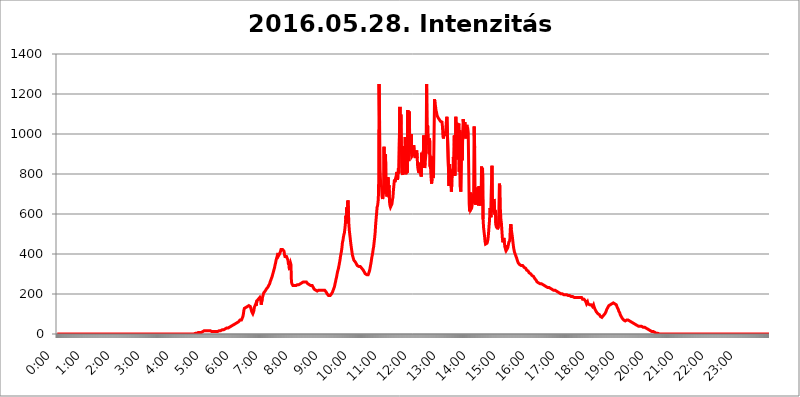
| Category | 2016.05.28. Intenzitás [W/m^2] |
|---|---|
| 0.0 | 0 |
| 0.0006944444444444445 | 0 |
| 0.001388888888888889 | 0 |
| 0.0020833333333333333 | 0 |
| 0.002777777777777778 | 0 |
| 0.003472222222222222 | 0 |
| 0.004166666666666667 | 0 |
| 0.004861111111111111 | 0 |
| 0.005555555555555556 | 0 |
| 0.0062499999999999995 | 0 |
| 0.006944444444444444 | 0 |
| 0.007638888888888889 | 0 |
| 0.008333333333333333 | 0 |
| 0.009027777777777779 | 0 |
| 0.009722222222222222 | 0 |
| 0.010416666666666666 | 0 |
| 0.011111111111111112 | 0 |
| 0.011805555555555555 | 0 |
| 0.012499999999999999 | 0 |
| 0.013194444444444444 | 0 |
| 0.013888888888888888 | 0 |
| 0.014583333333333332 | 0 |
| 0.015277777777777777 | 0 |
| 0.015972222222222224 | 0 |
| 0.016666666666666666 | 0 |
| 0.017361111111111112 | 0 |
| 0.018055555555555557 | 0 |
| 0.01875 | 0 |
| 0.019444444444444445 | 0 |
| 0.02013888888888889 | 0 |
| 0.020833333333333332 | 0 |
| 0.02152777777777778 | 0 |
| 0.022222222222222223 | 0 |
| 0.02291666666666667 | 0 |
| 0.02361111111111111 | 0 |
| 0.024305555555555556 | 0 |
| 0.024999999999999998 | 0 |
| 0.025694444444444447 | 0 |
| 0.02638888888888889 | 0 |
| 0.027083333333333334 | 0 |
| 0.027777777777777776 | 0 |
| 0.02847222222222222 | 0 |
| 0.029166666666666664 | 0 |
| 0.029861111111111113 | 0 |
| 0.030555555555555555 | 0 |
| 0.03125 | 0 |
| 0.03194444444444445 | 0 |
| 0.03263888888888889 | 0 |
| 0.03333333333333333 | 0 |
| 0.034027777777777775 | 0 |
| 0.034722222222222224 | 0 |
| 0.035416666666666666 | 0 |
| 0.036111111111111115 | 0 |
| 0.03680555555555556 | 0 |
| 0.0375 | 0 |
| 0.03819444444444444 | 0 |
| 0.03888888888888889 | 0 |
| 0.03958333333333333 | 0 |
| 0.04027777777777778 | 0 |
| 0.04097222222222222 | 0 |
| 0.041666666666666664 | 0 |
| 0.042361111111111106 | 0 |
| 0.04305555555555556 | 0 |
| 0.043750000000000004 | 0 |
| 0.044444444444444446 | 0 |
| 0.04513888888888889 | 0 |
| 0.04583333333333334 | 0 |
| 0.04652777777777778 | 0 |
| 0.04722222222222222 | 0 |
| 0.04791666666666666 | 0 |
| 0.04861111111111111 | 0 |
| 0.049305555555555554 | 0 |
| 0.049999999999999996 | 0 |
| 0.05069444444444445 | 0 |
| 0.051388888888888894 | 0 |
| 0.052083333333333336 | 0 |
| 0.05277777777777778 | 0 |
| 0.05347222222222222 | 0 |
| 0.05416666666666667 | 0 |
| 0.05486111111111111 | 0 |
| 0.05555555555555555 | 0 |
| 0.05625 | 0 |
| 0.05694444444444444 | 0 |
| 0.057638888888888885 | 0 |
| 0.05833333333333333 | 0 |
| 0.05902777777777778 | 0 |
| 0.059722222222222225 | 0 |
| 0.06041666666666667 | 0 |
| 0.061111111111111116 | 0 |
| 0.06180555555555556 | 0 |
| 0.0625 | 0 |
| 0.06319444444444444 | 0 |
| 0.06388888888888888 | 0 |
| 0.06458333333333334 | 0 |
| 0.06527777777777778 | 0 |
| 0.06597222222222222 | 0 |
| 0.06666666666666667 | 0 |
| 0.06736111111111111 | 0 |
| 0.06805555555555555 | 0 |
| 0.06874999999999999 | 0 |
| 0.06944444444444443 | 0 |
| 0.07013888888888889 | 0 |
| 0.07083333333333333 | 0 |
| 0.07152777777777779 | 0 |
| 0.07222222222222223 | 0 |
| 0.07291666666666667 | 0 |
| 0.07361111111111111 | 0 |
| 0.07430555555555556 | 0 |
| 0.075 | 0 |
| 0.07569444444444444 | 0 |
| 0.0763888888888889 | 0 |
| 0.07708333333333334 | 0 |
| 0.07777777777777778 | 0 |
| 0.07847222222222222 | 0 |
| 0.07916666666666666 | 0 |
| 0.0798611111111111 | 0 |
| 0.08055555555555556 | 0 |
| 0.08125 | 0 |
| 0.08194444444444444 | 0 |
| 0.08263888888888889 | 0 |
| 0.08333333333333333 | 0 |
| 0.08402777777777777 | 0 |
| 0.08472222222222221 | 0 |
| 0.08541666666666665 | 0 |
| 0.08611111111111112 | 0 |
| 0.08680555555555557 | 0 |
| 0.08750000000000001 | 0 |
| 0.08819444444444445 | 0 |
| 0.08888888888888889 | 0 |
| 0.08958333333333333 | 0 |
| 0.09027777777777778 | 0 |
| 0.09097222222222222 | 0 |
| 0.09166666666666667 | 0 |
| 0.09236111111111112 | 0 |
| 0.09305555555555556 | 0 |
| 0.09375 | 0 |
| 0.09444444444444444 | 0 |
| 0.09513888888888888 | 0 |
| 0.09583333333333333 | 0 |
| 0.09652777777777777 | 0 |
| 0.09722222222222222 | 0 |
| 0.09791666666666667 | 0 |
| 0.09861111111111111 | 0 |
| 0.09930555555555555 | 0 |
| 0.09999999999999999 | 0 |
| 0.10069444444444443 | 0 |
| 0.1013888888888889 | 0 |
| 0.10208333333333335 | 0 |
| 0.10277777777777779 | 0 |
| 0.10347222222222223 | 0 |
| 0.10416666666666667 | 0 |
| 0.10486111111111111 | 0 |
| 0.10555555555555556 | 0 |
| 0.10625 | 0 |
| 0.10694444444444444 | 0 |
| 0.1076388888888889 | 0 |
| 0.10833333333333334 | 0 |
| 0.10902777777777778 | 0 |
| 0.10972222222222222 | 0 |
| 0.1111111111111111 | 0 |
| 0.11180555555555556 | 0 |
| 0.11180555555555556 | 0 |
| 0.1125 | 0 |
| 0.11319444444444444 | 0 |
| 0.11388888888888889 | 0 |
| 0.11458333333333333 | 0 |
| 0.11527777777777777 | 0 |
| 0.11597222222222221 | 0 |
| 0.11666666666666665 | 0 |
| 0.1173611111111111 | 0 |
| 0.11805555555555557 | 0 |
| 0.11944444444444445 | 0 |
| 0.12013888888888889 | 0 |
| 0.12083333333333333 | 0 |
| 0.12152777777777778 | 0 |
| 0.12222222222222223 | 0 |
| 0.12291666666666667 | 0 |
| 0.12291666666666667 | 0 |
| 0.12361111111111112 | 0 |
| 0.12430555555555556 | 0 |
| 0.125 | 0 |
| 0.12569444444444444 | 0 |
| 0.12638888888888888 | 0 |
| 0.12708333333333333 | 0 |
| 0.16875 | 0 |
| 0.12847222222222224 | 0 |
| 0.12916666666666668 | 0 |
| 0.12986111111111112 | 0 |
| 0.13055555555555556 | 0 |
| 0.13125 | 0 |
| 0.13194444444444445 | 0 |
| 0.1326388888888889 | 0 |
| 0.13333333333333333 | 0 |
| 0.13402777777777777 | 0 |
| 0.13402777777777777 | 0 |
| 0.13472222222222222 | 0 |
| 0.13541666666666666 | 0 |
| 0.1361111111111111 | 0 |
| 0.13749999999999998 | 0 |
| 0.13819444444444443 | 0 |
| 0.1388888888888889 | 0 |
| 0.13958333333333334 | 0 |
| 0.14027777777777778 | 0 |
| 0.14097222222222222 | 0 |
| 0.14166666666666666 | 0 |
| 0.1423611111111111 | 0 |
| 0.14305555555555557 | 0 |
| 0.14375000000000002 | 0 |
| 0.14444444444444446 | 0 |
| 0.1451388888888889 | 0 |
| 0.1451388888888889 | 0 |
| 0.14652777777777778 | 0 |
| 0.14722222222222223 | 0 |
| 0.14791666666666667 | 0 |
| 0.1486111111111111 | 0 |
| 0.14930555555555555 | 0 |
| 0.15 | 0 |
| 0.15069444444444444 | 0 |
| 0.15138888888888888 | 0 |
| 0.15208333333333332 | 0 |
| 0.15277777777777776 | 0 |
| 0.15347222222222223 | 0 |
| 0.15416666666666667 | 0 |
| 0.15486111111111112 | 0 |
| 0.15555555555555556 | 0 |
| 0.15625 | 0 |
| 0.15694444444444444 | 0 |
| 0.15763888888888888 | 0 |
| 0.15833333333333333 | 0 |
| 0.15902777777777777 | 0 |
| 0.15972222222222224 | 0 |
| 0.16041666666666668 | 0 |
| 0.16111111111111112 | 0 |
| 0.16180555555555556 | 0 |
| 0.1625 | 0 |
| 0.16319444444444445 | 0 |
| 0.1638888888888889 | 0 |
| 0.16458333333333333 | 0 |
| 0.16527777777777777 | 0 |
| 0.16597222222222222 | 0 |
| 0.16666666666666666 | 0 |
| 0.1673611111111111 | 0 |
| 0.16805555555555554 | 0 |
| 0.16874999999999998 | 0 |
| 0.16944444444444443 | 0 |
| 0.17013888888888887 | 0 |
| 0.1708333333333333 | 0 |
| 0.17152777777777775 | 0 |
| 0.17222222222222225 | 0 |
| 0.1729166666666667 | 0 |
| 0.17361111111111113 | 0 |
| 0.17430555555555557 | 0 |
| 0.17500000000000002 | 0 |
| 0.17569444444444446 | 0 |
| 0.1763888888888889 | 0 |
| 0.17708333333333334 | 0 |
| 0.17777777777777778 | 0 |
| 0.17847222222222223 | 0 |
| 0.17916666666666667 | 0 |
| 0.1798611111111111 | 0 |
| 0.18055555555555555 | 0 |
| 0.18125 | 0 |
| 0.18194444444444444 | 0 |
| 0.1826388888888889 | 0 |
| 0.18333333333333335 | 0 |
| 0.1840277777777778 | 0 |
| 0.18472222222222223 | 0 |
| 0.18541666666666667 | 0 |
| 0.18611111111111112 | 0 |
| 0.18680555555555556 | 0 |
| 0.1875 | 0 |
| 0.18819444444444444 | 0 |
| 0.18888888888888888 | 0 |
| 0.18958333333333333 | 0 |
| 0.19027777777777777 | 0 |
| 0.1909722222222222 | 0 |
| 0.19166666666666665 | 0 |
| 0.19236111111111112 | 0 |
| 0.19305555555555554 | 3.525 |
| 0.19375 | 3.525 |
| 0.19444444444444445 | 3.525 |
| 0.1951388888888889 | 3.525 |
| 0.19583333333333333 | 3.525 |
| 0.19652777777777777 | 7.887 |
| 0.19722222222222222 | 7.887 |
| 0.19791666666666666 | 7.887 |
| 0.1986111111111111 | 7.887 |
| 0.19930555555555554 | 7.887 |
| 0.19999999999999998 | 7.887 |
| 0.20069444444444443 | 7.887 |
| 0.20138888888888887 | 7.887 |
| 0.2020833333333333 | 7.887 |
| 0.2027777777777778 | 12.257 |
| 0.2034722222222222 | 12.257 |
| 0.2041666666666667 | 12.257 |
| 0.20486111111111113 | 12.257 |
| 0.20555555555555557 | 12.257 |
| 0.20625000000000002 | 16.636 |
| 0.20694444444444446 | 16.636 |
| 0.2076388888888889 | 16.636 |
| 0.20833333333333334 | 16.636 |
| 0.20902777777777778 | 16.636 |
| 0.20972222222222223 | 16.636 |
| 0.21041666666666667 | 16.636 |
| 0.2111111111111111 | 16.636 |
| 0.21180555555555555 | 16.636 |
| 0.2125 | 16.636 |
| 0.21319444444444444 | 16.636 |
| 0.2138888888888889 | 16.636 |
| 0.21458333333333335 | 16.636 |
| 0.2152777777777778 | 16.636 |
| 0.21597222222222223 | 12.257 |
| 0.21666666666666667 | 12.257 |
| 0.21736111111111112 | 12.257 |
| 0.21805555555555556 | 12.257 |
| 0.21875 | 12.257 |
| 0.21944444444444444 | 12.257 |
| 0.22013888888888888 | 12.257 |
| 0.22083333333333333 | 12.257 |
| 0.22152777777777777 | 12.257 |
| 0.2222222222222222 | 12.257 |
| 0.22291666666666665 | 12.257 |
| 0.2236111111111111 | 12.257 |
| 0.22430555555555556 | 12.257 |
| 0.225 | 12.257 |
| 0.22569444444444445 | 12.257 |
| 0.2263888888888889 | 12.257 |
| 0.22708333333333333 | 16.636 |
| 0.22777777777777777 | 16.636 |
| 0.22847222222222222 | 16.636 |
| 0.22916666666666666 | 16.636 |
| 0.2298611111111111 | 16.636 |
| 0.23055555555555554 | 21.024 |
| 0.23124999999999998 | 21.024 |
| 0.23194444444444443 | 21.024 |
| 0.23263888888888887 | 21.024 |
| 0.2333333333333333 | 21.024 |
| 0.2340277777777778 | 25.419 |
| 0.2347222222222222 | 25.419 |
| 0.2354166666666667 | 25.419 |
| 0.23611111111111113 | 25.419 |
| 0.23680555555555557 | 29.823 |
| 0.23750000000000002 | 29.823 |
| 0.23819444444444446 | 29.823 |
| 0.2388888888888889 | 29.823 |
| 0.23958333333333334 | 29.823 |
| 0.24027777777777778 | 34.234 |
| 0.24097222222222223 | 34.234 |
| 0.24166666666666667 | 34.234 |
| 0.2423611111111111 | 38.653 |
| 0.24305555555555555 | 38.653 |
| 0.24375 | 38.653 |
| 0.24444444444444446 | 38.653 |
| 0.24513888888888888 | 38.653 |
| 0.24583333333333335 | 43.079 |
| 0.2465277777777778 | 43.079 |
| 0.24722222222222223 | 43.079 |
| 0.24791666666666667 | 47.511 |
| 0.24861111111111112 | 47.511 |
| 0.24930555555555556 | 47.511 |
| 0.25 | 51.951 |
| 0.25069444444444444 | 51.951 |
| 0.2513888888888889 | 56.398 |
| 0.2520833333333333 | 56.398 |
| 0.25277777777777777 | 56.398 |
| 0.2534722222222222 | 60.85 |
| 0.25416666666666665 | 60.85 |
| 0.2548611111111111 | 60.85 |
| 0.2555555555555556 | 65.31 |
| 0.25625000000000003 | 69.775 |
| 0.2569444444444445 | 69.775 |
| 0.2576388888888889 | 65.31 |
| 0.25833333333333336 | 69.775 |
| 0.2590277777777778 | 69.775 |
| 0.25972222222222224 | 74.246 |
| 0.2604166666666667 | 87.692 |
| 0.2611111111111111 | 101.184 |
| 0.26180555555555557 | 119.235 |
| 0.2625 | 128.284 |
| 0.26319444444444445 | 128.284 |
| 0.2638888888888889 | 132.814 |
| 0.26458333333333334 | 132.814 |
| 0.2652777777777778 | 137.347 |
| 0.2659722222222222 | 137.347 |
| 0.26666666666666666 | 137.347 |
| 0.2673611111111111 | 137.347 |
| 0.26805555555555555 | 141.884 |
| 0.26875 | 141.884 |
| 0.26944444444444443 | 137.347 |
| 0.2701388888888889 | 137.347 |
| 0.2708333333333333 | 137.347 |
| 0.27152777777777776 | 137.347 |
| 0.2722222222222222 | 119.235 |
| 0.27291666666666664 | 110.201 |
| 0.2736111111111111 | 105.69 |
| 0.2743055555555555 | 101.184 |
| 0.27499999999999997 | 105.69 |
| 0.27569444444444446 | 114.716 |
| 0.27638888888888885 | 132.814 |
| 0.27708333333333335 | 137.347 |
| 0.2777777777777778 | 137.347 |
| 0.27847222222222223 | 150.964 |
| 0.2791666666666667 | 141.884 |
| 0.2798611111111111 | 164.605 |
| 0.28055555555555556 | 169.156 |
| 0.28125 | 169.156 |
| 0.28194444444444444 | 173.709 |
| 0.2826388888888889 | 173.709 |
| 0.2833333333333333 | 178.264 |
| 0.28402777777777777 | 182.82 |
| 0.2847222222222222 | 178.264 |
| 0.28541666666666665 | 169.156 |
| 0.28611111111111115 | 146.423 |
| 0.28680555555555554 | 141.884 |
| 0.28750000000000003 | 178.264 |
| 0.2881944444444445 | 178.264 |
| 0.2888888888888889 | 196.497 |
| 0.28958333333333336 | 205.62 |
| 0.2902777777777778 | 205.62 |
| 0.29097222222222224 | 210.182 |
| 0.2916666666666667 | 214.746 |
| 0.2923611111111111 | 219.309 |
| 0.29305555555555557 | 223.873 |
| 0.29375 | 223.873 |
| 0.29444444444444445 | 228.436 |
| 0.2951388888888889 | 233 |
| 0.29583333333333334 | 237.564 |
| 0.2965277777777778 | 242.127 |
| 0.2972222222222222 | 246.689 |
| 0.29791666666666666 | 251.251 |
| 0.2986111111111111 | 260.373 |
| 0.29930555555555555 | 264.932 |
| 0.3 | 274.047 |
| 0.30069444444444443 | 278.603 |
| 0.3013888888888889 | 287.709 |
| 0.3020833333333333 | 296.808 |
| 0.30277777777777776 | 305.898 |
| 0.3034722222222222 | 314.98 |
| 0.30416666666666664 | 324.052 |
| 0.3048611111111111 | 333.113 |
| 0.3055555555555555 | 346.682 |
| 0.30624999999999997 | 355.712 |
| 0.3069444444444444 | 369.23 |
| 0.3076388888888889 | 378.224 |
| 0.30833333333333335 | 387.202 |
| 0.3090277777777778 | 396.164 |
| 0.30972222222222223 | 405.108 |
| 0.3104166666666667 | 391.685 |
| 0.3111111111111111 | 396.164 |
| 0.31180555555555556 | 400.638 |
| 0.3125 | 405.108 |
| 0.31319444444444444 | 414.035 |
| 0.3138888888888889 | 422.943 |
| 0.3145833333333333 | 427.39 |
| 0.31527777777777777 | 427.39 |
| 0.3159722222222222 | 422.943 |
| 0.31666666666666665 | 418.492 |
| 0.31736111111111115 | 418.492 |
| 0.31805555555555554 | 414.035 |
| 0.31875000000000003 | 396.164 |
| 0.3194444444444445 | 387.202 |
| 0.3201388888888889 | 382.715 |
| 0.32083333333333336 | 382.715 |
| 0.3215277777777778 | 387.202 |
| 0.32222222222222224 | 387.202 |
| 0.3229166666666667 | 382.715 |
| 0.3236111111111111 | 369.23 |
| 0.32430555555555557 | 346.682 |
| 0.325 | 364.728 |
| 0.32569444444444445 | 319.517 |
| 0.3263888888888889 | 346.682 |
| 0.32708333333333334 | 355.712 |
| 0.3277777777777778 | 346.682 |
| 0.3284722222222222 | 260.373 |
| 0.32916666666666666 | 251.251 |
| 0.3298611111111111 | 246.689 |
| 0.33055555555555555 | 242.127 |
| 0.33125 | 242.127 |
| 0.33194444444444443 | 242.127 |
| 0.3326388888888889 | 242.127 |
| 0.3333333333333333 | 242.127 |
| 0.3340277777777778 | 242.127 |
| 0.3347222222222222 | 242.127 |
| 0.3354166666666667 | 242.127 |
| 0.3361111111111111 | 246.689 |
| 0.3368055555555556 | 246.689 |
| 0.33749999999999997 | 246.689 |
| 0.33819444444444446 | 246.689 |
| 0.33888888888888885 | 246.689 |
| 0.33958333333333335 | 246.689 |
| 0.34027777777777773 | 246.689 |
| 0.34097222222222223 | 251.251 |
| 0.3416666666666666 | 251.251 |
| 0.3423611111111111 | 251.251 |
| 0.3430555555555555 | 255.813 |
| 0.34375 | 255.813 |
| 0.3444444444444445 | 260.373 |
| 0.3451388888888889 | 260.373 |
| 0.3458333333333334 | 260.373 |
| 0.34652777777777777 | 260.373 |
| 0.34722222222222227 | 260.373 |
| 0.34791666666666665 | 260.373 |
| 0.34861111111111115 | 260.373 |
| 0.34930555555555554 | 260.373 |
| 0.35000000000000003 | 255.813 |
| 0.3506944444444444 | 255.813 |
| 0.3513888888888889 | 251.251 |
| 0.3520833333333333 | 251.251 |
| 0.3527777777777778 | 251.251 |
| 0.3534722222222222 | 246.689 |
| 0.3541666666666667 | 246.689 |
| 0.3548611111111111 | 242.127 |
| 0.35555555555555557 | 242.127 |
| 0.35625 | 237.564 |
| 0.35694444444444445 | 242.127 |
| 0.3576388888888889 | 242.127 |
| 0.35833333333333334 | 242.127 |
| 0.3590277777777778 | 233 |
| 0.3597222222222222 | 228.436 |
| 0.36041666666666666 | 223.873 |
| 0.3611111111111111 | 223.873 |
| 0.36180555555555555 | 219.309 |
| 0.3625 | 219.309 |
| 0.36319444444444443 | 214.746 |
| 0.3638888888888889 | 219.309 |
| 0.3645833333333333 | 214.746 |
| 0.3652777777777778 | 214.746 |
| 0.3659722222222222 | 219.309 |
| 0.3666666666666667 | 219.309 |
| 0.3673611111111111 | 219.309 |
| 0.3680555555555556 | 219.309 |
| 0.36874999999999997 | 219.309 |
| 0.36944444444444446 | 223.873 |
| 0.37013888888888885 | 223.873 |
| 0.37083333333333335 | 219.309 |
| 0.37152777777777773 | 219.309 |
| 0.37222222222222223 | 219.309 |
| 0.3729166666666666 | 219.309 |
| 0.3736111111111111 | 219.309 |
| 0.3743055555555555 | 219.309 |
| 0.375 | 219.309 |
| 0.3756944444444445 | 219.309 |
| 0.3763888888888889 | 214.746 |
| 0.3770833333333334 | 210.182 |
| 0.37777777777777777 | 205.62 |
| 0.37847222222222227 | 201.058 |
| 0.37916666666666665 | 196.497 |
| 0.37986111111111115 | 196.497 |
| 0.38055555555555554 | 191.937 |
| 0.38125000000000003 | 191.937 |
| 0.3819444444444444 | 191.937 |
| 0.3826388888888889 | 191.937 |
| 0.3833333333333333 | 191.937 |
| 0.3840277777777778 | 191.937 |
| 0.3847222222222222 | 201.058 |
| 0.3854166666666667 | 201.058 |
| 0.3861111111111111 | 210.182 |
| 0.38680555555555557 | 214.746 |
| 0.3875 | 223.873 |
| 0.38819444444444445 | 228.436 |
| 0.3888888888888889 | 237.564 |
| 0.38958333333333334 | 251.251 |
| 0.3902777777777778 | 260.373 |
| 0.3909722222222222 | 274.047 |
| 0.39166666666666666 | 283.156 |
| 0.3923611111111111 | 296.808 |
| 0.39305555555555555 | 310.44 |
| 0.39375 | 319.517 |
| 0.39444444444444443 | 328.584 |
| 0.3951388888888889 | 342.162 |
| 0.3958333333333333 | 355.712 |
| 0.3965277777777778 | 369.23 |
| 0.3972222222222222 | 387.202 |
| 0.3979166666666667 | 400.638 |
| 0.3986111111111111 | 414.035 |
| 0.3993055555555556 | 431.833 |
| 0.39999999999999997 | 458.38 |
| 0.40069444444444446 | 467.187 |
| 0.40138888888888885 | 484.735 |
| 0.40208333333333335 | 497.836 |
| 0.40277777777777773 | 506.542 |
| 0.40347222222222223 | 528.2 |
| 0.4041666666666666 | 553.986 |
| 0.4048611111111111 | 592.233 |
| 0.4055555555555555 | 553.986 |
| 0.40625 | 634.105 |
| 0.4069444444444445 | 571.049 |
| 0.4076388888888889 | 667.123 |
| 0.4083333333333334 | 613.252 |
| 0.40902777777777777 | 549.704 |
| 0.40972222222222227 | 515.223 |
| 0.41041666666666665 | 493.475 |
| 0.41111111111111115 | 471.582 |
| 0.41180555555555554 | 449.551 |
| 0.41250000000000003 | 431.833 |
| 0.4131944444444444 | 414.035 |
| 0.4138888888888889 | 396.164 |
| 0.4145833333333333 | 387.202 |
| 0.4152777777777778 | 378.224 |
| 0.4159722222222222 | 369.23 |
| 0.4166666666666667 | 369.23 |
| 0.4173611111111111 | 364.728 |
| 0.41805555555555557 | 360.221 |
| 0.41875 | 355.712 |
| 0.41944444444444445 | 351.198 |
| 0.4201388888888889 | 346.682 |
| 0.42083333333333334 | 342.162 |
| 0.4215277777777778 | 342.162 |
| 0.4222222222222222 | 337.639 |
| 0.42291666666666666 | 337.639 |
| 0.4236111111111111 | 337.639 |
| 0.42430555555555555 | 337.639 |
| 0.425 | 337.639 |
| 0.42569444444444443 | 333.113 |
| 0.4263888888888889 | 333.113 |
| 0.4270833333333333 | 328.584 |
| 0.4277777777777778 | 324.052 |
| 0.4284722222222222 | 324.052 |
| 0.4291666666666667 | 319.517 |
| 0.4298611111111111 | 314.98 |
| 0.4305555555555556 | 310.44 |
| 0.43124999999999997 | 305.898 |
| 0.43194444444444446 | 301.354 |
| 0.43263888888888885 | 296.808 |
| 0.43333333333333335 | 296.808 |
| 0.43402777777777773 | 296.808 |
| 0.43472222222222223 | 296.808 |
| 0.4354166666666666 | 296.808 |
| 0.4361111111111111 | 296.808 |
| 0.4368055555555555 | 301.354 |
| 0.4375 | 310.44 |
| 0.4381944444444445 | 319.517 |
| 0.4388888888888889 | 333.113 |
| 0.4395833333333334 | 346.682 |
| 0.44027777777777777 | 360.221 |
| 0.44097222222222227 | 378.224 |
| 0.44166666666666665 | 391.685 |
| 0.44236111111111115 | 405.108 |
| 0.44305555555555554 | 422.943 |
| 0.44375000000000003 | 436.27 |
| 0.4444444444444444 | 458.38 |
| 0.4451388888888889 | 480.356 |
| 0.4458333333333333 | 506.542 |
| 0.4465277777777778 | 545.416 |
| 0.4472222222222222 | 575.299 |
| 0.4479166666666667 | 604.864 |
| 0.4486111111111111 | 634.105 |
| 0.44930555555555557 | 642.4 |
| 0.45 | 663.019 |
| 0.45069444444444445 | 707.8 |
| 0.4513888888888889 | 1250.275 |
| 0.45208333333333334 | 1052.255 |
| 0.4527777777777778 | 822.26 |
| 0.4534722222222222 | 759.723 |
| 0.45416666666666666 | 743.859 |
| 0.4548611111111111 | 735.89 |
| 0.45555555555555555 | 687.544 |
| 0.45625 | 675.311 |
| 0.45694444444444443 | 683.473 |
| 0.4576388888888889 | 707.8 |
| 0.4583333333333333 | 936.33 |
| 0.4590277777777778 | 703.762 |
| 0.4597222222222222 | 715.858 |
| 0.4604166666666667 | 898.668 |
| 0.4611111111111111 | 723.889 |
| 0.4618055555555556 | 703.762 |
| 0.46249999999999997 | 687.544 |
| 0.46319444444444446 | 687.544 |
| 0.46388888888888885 | 783.342 |
| 0.46458333333333335 | 727.896 |
| 0.46527777777777773 | 743.859 |
| 0.46597222222222223 | 663.019 |
| 0.4666666666666666 | 642.4 |
| 0.4673611111111111 | 634.105 |
| 0.4680555555555555 | 634.105 |
| 0.46875 | 638.256 |
| 0.4694444444444445 | 650.667 |
| 0.4701388888888889 | 671.22 |
| 0.4708333333333334 | 683.473 |
| 0.47152777777777777 | 719.877 |
| 0.47222222222222227 | 719.877 |
| 0.47291666666666665 | 771.559 |
| 0.47361111111111115 | 759.723 |
| 0.47430555555555554 | 775.492 |
| 0.47500000000000003 | 775.492 |
| 0.4756944444444444 | 795.074 |
| 0.4763888888888889 | 810.641 |
| 0.4770833333333333 | 771.559 |
| 0.4777777777777778 | 783.342 |
| 0.4784722222222222 | 829.981 |
| 0.4791666666666667 | 802.868 |
| 0.4798611111111111 | 802.868 |
| 0.48055555555555557 | 1135.543 |
| 0.48125 | 996.182 |
| 0.48194444444444445 | 1097.437 |
| 0.4826388888888889 | 940.082 |
| 0.48333333333333334 | 833.834 |
| 0.4840277777777778 | 806.757 |
| 0.4847222222222222 | 795.074 |
| 0.48541666666666666 | 940.082 |
| 0.4861111111111111 | 849.199 |
| 0.48680555555555555 | 856.855 |
| 0.4875 | 841.526 |
| 0.48819444444444443 | 984.98 |
| 0.4888888888888889 | 798.974 |
| 0.4895833333333333 | 795.074 |
| 0.4902777777777778 | 849.199 |
| 0.4909722222222222 | 806.757 |
| 0.4916666666666667 | 1120.238 |
| 0.4923611111111111 | 864.493 |
| 0.4930555555555556 | 1014.852 |
| 0.49374999999999997 | 1112.618 |
| 0.49444444444444446 | 947.58 |
| 0.49513888888888885 | 917.534 |
| 0.49583333333333335 | 902.447 |
| 0.49652777777777773 | 999.916 |
| 0.49722222222222223 | 887.309 |
| 0.4979166666666666 | 887.309 |
| 0.4986111111111111 | 891.099 |
| 0.4993055555555555 | 898.668 |
| 0.5 | 943.832 |
| 0.5006944444444444 | 902.447 |
| 0.5013888888888889 | 902.447 |
| 0.5020833333333333 | 879.719 |
| 0.5027777777777778 | 875.918 |
| 0.5034722222222222 | 883.516 |
| 0.5041666666666667 | 917.534 |
| 0.5048611111111111 | 879.719 |
| 0.5055555555555555 | 833.834 |
| 0.50625 | 829.981 |
| 0.5069444444444444 | 806.757 |
| 0.5076388888888889 | 849.199 |
| 0.5083333333333333 | 818.392 |
| 0.5090277777777777 | 802.868 |
| 0.5097222222222222 | 856.855 |
| 0.5104166666666666 | 787.258 |
| 0.5111111111111112 | 906.223 |
| 0.5118055555555555 | 829.981 |
| 0.5125000000000001 | 860.676 |
| 0.5131944444444444 | 853.029 |
| 0.513888888888889 | 992.448 |
| 0.5145833333333333 | 928.819 |
| 0.5152777777777778 | 829.981 |
| 0.5159722222222222 | 856.855 |
| 0.5166666666666667 | 860.676 |
| 0.517361111111111 | 909.996 |
| 0.5180555555555556 | 1250.275 |
| 0.5187499999999999 | 962.555 |
| 0.5194444444444445 | 1044.762 |
| 0.5201388888888888 | 962.555 |
| 0.5208333333333334 | 947.58 |
| 0.5215277777777778 | 902.447 |
| 0.5222222222222223 | 977.508 |
| 0.5229166666666667 | 837.682 |
| 0.5236111111111111 | 829.981 |
| 0.5243055555555556 | 783.342 |
| 0.525 | 751.803 |
| 0.5256944444444445 | 775.492 |
| 0.5263888888888889 | 887.309 |
| 0.5270833333333333 | 779.42 |
| 0.5277777777777778 | 798.974 |
| 0.5284722222222222 | 988.714 |
| 0.5291666666666667 | 1174.263 |
| 0.5298611111111111 | 1150.946 |
| 0.5305555555555556 | 1139.384 |
| 0.53125 | 1116.426 |
| 0.5319444444444444 | 1108.816 |
| 0.5326388888888889 | 1093.653 |
| 0.5333333333333333 | 1093.653 |
| 0.5340277777777778 | 1082.324 |
| 0.5347222222222222 | 1078.555 |
| 0.5354166666666667 | 1074.789 |
| 0.5361111111111111 | 1071.027 |
| 0.5368055555555555 | 1071.027 |
| 0.5375 | 1063.51 |
| 0.5381944444444444 | 1067.267 |
| 0.5388888888888889 | 1059.756 |
| 0.5395833333333333 | 1059.756 |
| 0.5402777777777777 | 1037.277 |
| 0.5409722222222222 | 988.714 |
| 0.5416666666666666 | 977.508 |
| 0.5423611111111112 | 996.182 |
| 0.5430555555555555 | 1007.383 |
| 0.5437500000000001 | 992.448 |
| 0.5444444444444444 | 1003.65 |
| 0.545138888888889 | 1029.798 |
| 0.5458333333333333 | 1063.51 |
| 0.5465277777777778 | 1086.097 |
| 0.5472222222222222 | 1089.873 |
| 0.5479166666666667 | 1082.324 |
| 0.548611111111111 | 837.682 |
| 0.5493055555555556 | 739.877 |
| 0.5499999999999999 | 849.199 |
| 0.5506944444444445 | 810.641 |
| 0.5513888888888888 | 822.26 |
| 0.5520833333333334 | 751.803 |
| 0.5527777777777778 | 711.832 |
| 0.5534722222222223 | 759.723 |
| 0.5541666666666667 | 798.974 |
| 0.5548611111111111 | 810.641 |
| 0.5555555555555556 | 883.516 |
| 0.55625 | 837.682 |
| 0.5569444444444445 | 992.448 |
| 0.5576388888888889 | 791.169 |
| 0.5583333333333333 | 932.576 |
| 0.5590277777777778 | 1086.097 |
| 0.5597222222222222 | 928.819 |
| 0.5604166666666667 | 1056.004 |
| 0.5611111111111111 | 1033.537 |
| 0.5618055555555556 | 872.114 |
| 0.5625 | 1033.537 |
| 0.5631944444444444 | 1052.255 |
| 0.5638888888888889 | 810.641 |
| 0.5645833333333333 | 1018.587 |
| 0.5652777777777778 | 735.89 |
| 0.5659722222222222 | 711.832 |
| 0.5666666666666667 | 868.305 |
| 0.5673611111111111 | 902.447 |
| 0.5680555555555555 | 868.305 |
| 0.56875 | 1011.118 |
| 0.5694444444444444 | 1074.789 |
| 0.5701388888888889 | 1022.323 |
| 0.5708333333333333 | 996.182 |
| 0.5715277777777777 | 1059.756 |
| 0.5722222222222222 | 1026.06 |
| 0.5729166666666666 | 977.508 |
| 0.5736111111111112 | 1022.323 |
| 0.5743055555555555 | 1044.762 |
| 0.5750000000000001 | 1037.277 |
| 0.5756944444444444 | 1029.798 |
| 0.576388888888889 | 1007.383 |
| 0.5770833333333333 | 829.981 |
| 0.5777777777777778 | 650.667 |
| 0.5784722222222222 | 613.252 |
| 0.5791666666666667 | 707.8 |
| 0.579861111111111 | 621.613 |
| 0.5805555555555556 | 621.613 |
| 0.5812499999999999 | 629.948 |
| 0.5819444444444445 | 646.537 |
| 0.5826388888888888 | 658.909 |
| 0.5833333333333334 | 679.395 |
| 0.5840277777777778 | 707.8 |
| 0.5847222222222223 | 1037.277 |
| 0.5854166666666667 | 932.576 |
| 0.5861111111111111 | 663.019 |
| 0.5868055555555556 | 646.537 |
| 0.5875 | 683.473 |
| 0.5881944444444445 | 650.667 |
| 0.5888888888888889 | 650.667 |
| 0.5895833333333333 | 731.896 |
| 0.5902777777777778 | 695.666 |
| 0.5909722222222222 | 642.4 |
| 0.5916666666666667 | 739.877 |
| 0.5923611111111111 | 723.889 |
| 0.5930555555555556 | 650.667 |
| 0.59375 | 642.4 |
| 0.5944444444444444 | 675.311 |
| 0.5951388888888889 | 837.682 |
| 0.5958333333333333 | 798.974 |
| 0.5965277777777778 | 829.981 |
| 0.5972222222222222 | 575.299 |
| 0.5979166666666667 | 532.513 |
| 0.5986111111111111 | 528.2 |
| 0.5993055555555555 | 489.108 |
| 0.6 | 462.786 |
| 0.6006944444444444 | 449.551 |
| 0.6013888888888889 | 445.129 |
| 0.6020833333333333 | 445.129 |
| 0.6027777777777777 | 453.968 |
| 0.6034722222222222 | 462.786 |
| 0.6041666666666666 | 475.972 |
| 0.6048611111111112 | 502.192 |
| 0.6055555555555555 | 536.82 |
| 0.6062500000000001 | 566.793 |
| 0.6069444444444444 | 629.948 |
| 0.607638888888889 | 613.252 |
| 0.6083333333333333 | 583.779 |
| 0.6090277777777778 | 747.834 |
| 0.6097222222222222 | 841.526 |
| 0.6104166666666667 | 609.062 |
| 0.611111111111111 | 617.436 |
| 0.6118055555555556 | 629.948 |
| 0.6124999999999999 | 675.311 |
| 0.6131944444444445 | 675.311 |
| 0.6138888888888888 | 596.45 |
| 0.6145833333333334 | 617.436 |
| 0.6152777777777778 | 545.416 |
| 0.6159722222222223 | 532.513 |
| 0.6166666666666667 | 549.704 |
| 0.6173611111111111 | 523.88 |
| 0.6180555555555556 | 523.88 |
| 0.61875 | 536.82 |
| 0.6194444444444445 | 621.613 |
| 0.6201388888888889 | 751.803 |
| 0.6208333333333333 | 735.89 |
| 0.6215277777777778 | 617.436 |
| 0.6222222222222222 | 575.299 |
| 0.6229166666666667 | 553.986 |
| 0.6236111111111111 | 549.704 |
| 0.6243055555555556 | 480.356 |
| 0.625 | 458.38 |
| 0.6256944444444444 | 467.187 |
| 0.6263888888888889 | 480.356 |
| 0.6270833333333333 | 458.38 |
| 0.6277777777777778 | 436.27 |
| 0.6284722222222222 | 427.39 |
| 0.6291666666666667 | 436.27 |
| 0.6298611111111111 | 445.129 |
| 0.6305555555555555 | 422.943 |
| 0.63125 | 427.39 |
| 0.6319444444444444 | 431.833 |
| 0.6326388888888889 | 436.27 |
| 0.6333333333333333 | 458.38 |
| 0.6340277777777777 | 453.968 |
| 0.6347222222222222 | 467.187 |
| 0.6354166666666666 | 523.88 |
| 0.6361111111111112 | 549.704 |
| 0.6368055555555555 | 523.88 |
| 0.6375000000000001 | 506.542 |
| 0.6381944444444444 | 489.108 |
| 0.638888888888889 | 467.187 |
| 0.6395833333333333 | 445.129 |
| 0.6402777777777778 | 427.39 |
| 0.6409722222222222 | 414.035 |
| 0.6416666666666667 | 405.108 |
| 0.642361111111111 | 400.638 |
| 0.6430555555555556 | 391.685 |
| 0.6437499999999999 | 387.202 |
| 0.6444444444444445 | 378.224 |
| 0.6451388888888888 | 369.23 |
| 0.6458333333333334 | 364.728 |
| 0.6465277777777778 | 355.712 |
| 0.6472222222222223 | 351.198 |
| 0.6479166666666667 | 351.198 |
| 0.6486111111111111 | 346.682 |
| 0.6493055555555556 | 346.682 |
| 0.65 | 346.682 |
| 0.6506944444444445 | 342.162 |
| 0.6513888888888889 | 346.682 |
| 0.6520833333333333 | 346.682 |
| 0.6527777777777778 | 342.162 |
| 0.6534722222222222 | 337.639 |
| 0.6541666666666667 | 337.639 |
| 0.6548611111111111 | 333.113 |
| 0.6555555555555556 | 333.113 |
| 0.65625 | 333.113 |
| 0.6569444444444444 | 328.584 |
| 0.6576388888888889 | 324.052 |
| 0.6583333333333333 | 319.517 |
| 0.6590277777777778 | 319.517 |
| 0.6597222222222222 | 314.98 |
| 0.6604166666666667 | 314.98 |
| 0.6611111111111111 | 310.44 |
| 0.6618055555555555 | 305.898 |
| 0.6625 | 305.898 |
| 0.6631944444444444 | 305.898 |
| 0.6638888888888889 | 301.354 |
| 0.6645833333333333 | 296.808 |
| 0.6652777777777777 | 296.808 |
| 0.6659722222222222 | 292.259 |
| 0.6666666666666666 | 292.259 |
| 0.6673611111111111 | 287.709 |
| 0.6680555555555556 | 287.709 |
| 0.6687500000000001 | 283.156 |
| 0.6694444444444444 | 278.603 |
| 0.6701388888888888 | 278.603 |
| 0.6708333333333334 | 278.603 |
| 0.6715277777777778 | 269.49 |
| 0.6722222222222222 | 264.932 |
| 0.6729166666666666 | 260.373 |
| 0.6736111111111112 | 260.373 |
| 0.6743055555555556 | 255.813 |
| 0.6749999999999999 | 255.813 |
| 0.6756944444444444 | 255.813 |
| 0.6763888888888889 | 251.251 |
| 0.6770833333333334 | 251.251 |
| 0.6777777777777777 | 251.251 |
| 0.6784722222222223 | 251.251 |
| 0.6791666666666667 | 251.251 |
| 0.6798611111111111 | 246.689 |
| 0.6805555555555555 | 246.689 |
| 0.68125 | 246.689 |
| 0.6819444444444445 | 242.127 |
| 0.6826388888888889 | 242.127 |
| 0.6833333333333332 | 242.127 |
| 0.6840277777777778 | 242.127 |
| 0.6847222222222222 | 237.564 |
| 0.6854166666666667 | 237.564 |
| 0.686111111111111 | 237.564 |
| 0.6868055555555556 | 237.564 |
| 0.6875 | 233 |
| 0.6881944444444444 | 233 |
| 0.688888888888889 | 233 |
| 0.6895833333333333 | 233 |
| 0.6902777777777778 | 228.436 |
| 0.6909722222222222 | 228.436 |
| 0.6916666666666668 | 228.436 |
| 0.6923611111111111 | 223.873 |
| 0.6930555555555555 | 223.873 |
| 0.69375 | 223.873 |
| 0.6944444444444445 | 223.873 |
| 0.6951388888888889 | 223.873 |
| 0.6958333333333333 | 219.309 |
| 0.6965277777777777 | 219.309 |
| 0.6972222222222223 | 219.309 |
| 0.6979166666666666 | 219.309 |
| 0.6986111111111111 | 214.746 |
| 0.6993055555555556 | 214.746 |
| 0.7000000000000001 | 214.746 |
| 0.7006944444444444 | 210.182 |
| 0.7013888888888888 | 210.182 |
| 0.7020833333333334 | 210.182 |
| 0.7027777777777778 | 205.62 |
| 0.7034722222222222 | 205.62 |
| 0.7041666666666666 | 205.62 |
| 0.7048611111111112 | 201.058 |
| 0.7055555555555556 | 201.058 |
| 0.7062499999999999 | 201.058 |
| 0.7069444444444444 | 201.058 |
| 0.7076388888888889 | 201.058 |
| 0.7083333333333334 | 201.058 |
| 0.7090277777777777 | 201.058 |
| 0.7097222222222223 | 201.058 |
| 0.7104166666666667 | 196.497 |
| 0.7111111111111111 | 196.497 |
| 0.7118055555555555 | 196.497 |
| 0.7125 | 196.497 |
| 0.7131944444444445 | 196.497 |
| 0.7138888888888889 | 196.497 |
| 0.7145833333333332 | 196.497 |
| 0.7152777777777778 | 196.497 |
| 0.7159722222222222 | 196.497 |
| 0.7166666666666667 | 191.937 |
| 0.717361111111111 | 191.937 |
| 0.7180555555555556 | 191.937 |
| 0.71875 | 191.937 |
| 0.7194444444444444 | 191.937 |
| 0.720138888888889 | 187.378 |
| 0.7208333333333333 | 187.378 |
| 0.7215277777777778 | 187.378 |
| 0.7222222222222222 | 187.378 |
| 0.7229166666666668 | 187.378 |
| 0.7236111111111111 | 187.378 |
| 0.7243055555555555 | 182.82 |
| 0.725 | 182.82 |
| 0.7256944444444445 | 187.378 |
| 0.7263888888888889 | 187.378 |
| 0.7270833333333333 | 182.82 |
| 0.7277777777777777 | 182.82 |
| 0.7284722222222223 | 182.82 |
| 0.7291666666666666 | 182.82 |
| 0.7298611111111111 | 182.82 |
| 0.7305555555555556 | 182.82 |
| 0.7312500000000001 | 182.82 |
| 0.7319444444444444 | 182.82 |
| 0.7326388888888888 | 182.82 |
| 0.7333333333333334 | 182.82 |
| 0.7340277777777778 | 182.82 |
| 0.7347222222222222 | 182.82 |
| 0.7354166666666666 | 182.82 |
| 0.7361111111111112 | 178.264 |
| 0.7368055555555556 | 173.709 |
| 0.7374999999999999 | 169.156 |
| 0.7381944444444444 | 173.709 |
| 0.7388888888888889 | 173.709 |
| 0.7395833333333334 | 169.156 |
| 0.7402777777777777 | 173.709 |
| 0.7409722222222223 | 164.605 |
| 0.7416666666666667 | 164.605 |
| 0.7423611111111111 | 150.964 |
| 0.7430555555555555 | 155.509 |
| 0.74375 | 160.056 |
| 0.7444444444444445 | 150.964 |
| 0.7451388888888889 | 146.423 |
| 0.7458333333333332 | 150.964 |
| 0.7465277777777778 | 146.423 |
| 0.7472222222222222 | 150.964 |
| 0.7479166666666667 | 146.423 |
| 0.748611111111111 | 146.423 |
| 0.7493055555555556 | 146.423 |
| 0.75 | 141.884 |
| 0.7506944444444444 | 137.347 |
| 0.751388888888889 | 141.884 |
| 0.7520833333333333 | 146.423 |
| 0.7527777777777778 | 137.347 |
| 0.7534722222222222 | 132.814 |
| 0.7541666666666668 | 123.758 |
| 0.7548611111111111 | 119.235 |
| 0.7555555555555555 | 119.235 |
| 0.75625 | 110.201 |
| 0.7569444444444445 | 105.69 |
| 0.7576388888888889 | 105.69 |
| 0.7583333333333333 | 101.184 |
| 0.7590277777777777 | 101.184 |
| 0.7597222222222223 | 96.682 |
| 0.7604166666666666 | 96.682 |
| 0.7611111111111111 | 92.184 |
| 0.7618055555555556 | 87.692 |
| 0.7625000000000001 | 87.692 |
| 0.7631944444444444 | 83.205 |
| 0.7638888888888888 | 83.205 |
| 0.7645833333333334 | 87.692 |
| 0.7652777777777778 | 87.692 |
| 0.7659722222222222 | 92.184 |
| 0.7666666666666666 | 92.184 |
| 0.7673611111111112 | 96.682 |
| 0.7680555555555556 | 101.184 |
| 0.7687499999999999 | 105.69 |
| 0.7694444444444444 | 110.201 |
| 0.7701388888888889 | 114.716 |
| 0.7708333333333334 | 123.758 |
| 0.7715277777777777 | 128.284 |
| 0.7722222222222223 | 132.814 |
| 0.7729166666666667 | 137.347 |
| 0.7736111111111111 | 141.884 |
| 0.7743055555555555 | 146.423 |
| 0.775 | 146.423 |
| 0.7756944444444445 | 146.423 |
| 0.7763888888888889 | 146.423 |
| 0.7770833333333332 | 150.964 |
| 0.7777777777777778 | 150.964 |
| 0.7784722222222222 | 150.964 |
| 0.7791666666666667 | 155.509 |
| 0.779861111111111 | 155.509 |
| 0.7805555555555556 | 155.509 |
| 0.78125 | 155.509 |
| 0.7819444444444444 | 150.964 |
| 0.782638888888889 | 150.964 |
| 0.7833333333333333 | 150.964 |
| 0.7840277777777778 | 146.423 |
| 0.7847222222222222 | 141.884 |
| 0.7854166666666668 | 132.814 |
| 0.7861111111111111 | 128.284 |
| 0.7868055555555555 | 123.758 |
| 0.7875 | 114.716 |
| 0.7881944444444445 | 110.201 |
| 0.7888888888888889 | 105.69 |
| 0.7895833333333333 | 96.682 |
| 0.7902777777777777 | 92.184 |
| 0.7909722222222223 | 87.692 |
| 0.7916666666666666 | 83.205 |
| 0.7923611111111111 | 78.722 |
| 0.7930555555555556 | 74.246 |
| 0.7937500000000001 | 74.246 |
| 0.7944444444444444 | 69.775 |
| 0.7951388888888888 | 69.775 |
| 0.7958333333333334 | 69.775 |
| 0.7965277777777778 | 65.31 |
| 0.7972222222222222 | 65.31 |
| 0.7979166666666666 | 69.775 |
| 0.7986111111111112 | 69.775 |
| 0.7993055555555556 | 65.31 |
| 0.7999999999999999 | 65.31 |
| 0.8006944444444444 | 69.775 |
| 0.8013888888888889 | 65.31 |
| 0.8020833333333334 | 65.31 |
| 0.8027777777777777 | 65.31 |
| 0.8034722222222223 | 65.31 |
| 0.8041666666666667 | 65.31 |
| 0.8048611111111111 | 60.85 |
| 0.8055555555555555 | 60.85 |
| 0.80625 | 60.85 |
| 0.8069444444444445 | 56.398 |
| 0.8076388888888889 | 56.398 |
| 0.8083333333333332 | 56.398 |
| 0.8090277777777778 | 51.951 |
| 0.8097222222222222 | 51.951 |
| 0.8104166666666667 | 47.511 |
| 0.811111111111111 | 47.511 |
| 0.8118055555555556 | 47.511 |
| 0.8125 | 43.079 |
| 0.8131944444444444 | 43.079 |
| 0.813888888888889 | 43.079 |
| 0.8145833333333333 | 38.653 |
| 0.8152777777777778 | 38.653 |
| 0.8159722222222222 | 38.653 |
| 0.8166666666666668 | 38.653 |
| 0.8173611111111111 | 38.653 |
| 0.8180555555555555 | 38.653 |
| 0.81875 | 38.653 |
| 0.8194444444444445 | 38.653 |
| 0.8201388888888889 | 34.234 |
| 0.8208333333333333 | 34.234 |
| 0.8215277777777777 | 34.234 |
| 0.8222222222222223 | 38.653 |
| 0.8229166666666666 | 34.234 |
| 0.8236111111111111 | 34.234 |
| 0.8243055555555556 | 34.234 |
| 0.8250000000000001 | 29.823 |
| 0.8256944444444444 | 29.823 |
| 0.8263888888888888 | 29.823 |
| 0.8270833333333334 | 29.823 |
| 0.8277777777777778 | 25.419 |
| 0.8284722222222222 | 25.419 |
| 0.8291666666666666 | 21.024 |
| 0.8298611111111112 | 21.024 |
| 0.8305555555555556 | 16.636 |
| 0.8312499999999999 | 16.636 |
| 0.8319444444444444 | 16.636 |
| 0.8326388888888889 | 12.257 |
| 0.8333333333333334 | 12.257 |
| 0.8340277777777777 | 12.257 |
| 0.8347222222222223 | 12.257 |
| 0.8354166666666667 | 12.257 |
| 0.8361111111111111 | 12.257 |
| 0.8368055555555555 | 7.887 |
| 0.8375 | 7.887 |
| 0.8381944444444445 | 7.887 |
| 0.8388888888888889 | 7.887 |
| 0.8395833333333332 | 3.525 |
| 0.8402777777777778 | 3.525 |
| 0.8409722222222222 | 3.525 |
| 0.8416666666666667 | 3.525 |
| 0.842361111111111 | 3.525 |
| 0.8430555555555556 | 3.525 |
| 0.84375 | 3.525 |
| 0.8444444444444444 | 0 |
| 0.845138888888889 | 0 |
| 0.8458333333333333 | 0 |
| 0.8465277777777778 | 0 |
| 0.8472222222222222 | 0 |
| 0.8479166666666668 | 0 |
| 0.8486111111111111 | 0 |
| 0.8493055555555555 | 0 |
| 0.85 | 0 |
| 0.8506944444444445 | 0 |
| 0.8513888888888889 | 0 |
| 0.8520833333333333 | 0 |
| 0.8527777777777777 | 0 |
| 0.8534722222222223 | 0 |
| 0.8541666666666666 | 0 |
| 0.8548611111111111 | 0 |
| 0.8555555555555556 | 0 |
| 0.8562500000000001 | 0 |
| 0.8569444444444444 | 0 |
| 0.8576388888888888 | 0 |
| 0.8583333333333334 | 0 |
| 0.8590277777777778 | 0 |
| 0.8597222222222222 | 0 |
| 0.8604166666666666 | 0 |
| 0.8611111111111112 | 0 |
| 0.8618055555555556 | 0 |
| 0.8624999999999999 | 0 |
| 0.8631944444444444 | 0 |
| 0.8638888888888889 | 0 |
| 0.8645833333333334 | 0 |
| 0.8652777777777777 | 0 |
| 0.8659722222222223 | 0 |
| 0.8666666666666667 | 0 |
| 0.8673611111111111 | 0 |
| 0.8680555555555555 | 0 |
| 0.86875 | 0 |
| 0.8694444444444445 | 0 |
| 0.8701388888888889 | 0 |
| 0.8708333333333332 | 0 |
| 0.8715277777777778 | 0 |
| 0.8722222222222222 | 0 |
| 0.8729166666666667 | 0 |
| 0.873611111111111 | 0 |
| 0.8743055555555556 | 0 |
| 0.875 | 0 |
| 0.8756944444444444 | 0 |
| 0.876388888888889 | 0 |
| 0.8770833333333333 | 0 |
| 0.8777777777777778 | 0 |
| 0.8784722222222222 | 0 |
| 0.8791666666666668 | 0 |
| 0.8798611111111111 | 0 |
| 0.8805555555555555 | 0 |
| 0.88125 | 0 |
| 0.8819444444444445 | 0 |
| 0.8826388888888889 | 0 |
| 0.8833333333333333 | 0 |
| 0.8840277777777777 | 0 |
| 0.8847222222222223 | 0 |
| 0.8854166666666666 | 0 |
| 0.8861111111111111 | 0 |
| 0.8868055555555556 | 0 |
| 0.8875000000000001 | 0 |
| 0.8881944444444444 | 0 |
| 0.8888888888888888 | 0 |
| 0.8895833333333334 | 0 |
| 0.8902777777777778 | 0 |
| 0.8909722222222222 | 0 |
| 0.8916666666666666 | 0 |
| 0.8923611111111112 | 0 |
| 0.8930555555555556 | 0 |
| 0.8937499999999999 | 0 |
| 0.8944444444444444 | 0 |
| 0.8951388888888889 | 0 |
| 0.8958333333333334 | 0 |
| 0.8965277777777777 | 0 |
| 0.8972222222222223 | 0 |
| 0.8979166666666667 | 0 |
| 0.8986111111111111 | 0 |
| 0.8993055555555555 | 0 |
| 0.9 | 0 |
| 0.9006944444444445 | 0 |
| 0.9013888888888889 | 0 |
| 0.9020833333333332 | 0 |
| 0.9027777777777778 | 0 |
| 0.9034722222222222 | 0 |
| 0.9041666666666667 | 0 |
| 0.904861111111111 | 0 |
| 0.9055555555555556 | 0 |
| 0.90625 | 0 |
| 0.9069444444444444 | 0 |
| 0.907638888888889 | 0 |
| 0.9083333333333333 | 0 |
| 0.9090277777777778 | 0 |
| 0.9097222222222222 | 0 |
| 0.9104166666666668 | 0 |
| 0.9111111111111111 | 0 |
| 0.9118055555555555 | 0 |
| 0.9125 | 0 |
| 0.9131944444444445 | 0 |
| 0.9138888888888889 | 0 |
| 0.9145833333333333 | 0 |
| 0.9152777777777777 | 0 |
| 0.9159722222222223 | 0 |
| 0.9166666666666666 | 0 |
| 0.9173611111111111 | 0 |
| 0.9180555555555556 | 0 |
| 0.9187500000000001 | 0 |
| 0.9194444444444444 | 0 |
| 0.9201388888888888 | 0 |
| 0.9208333333333334 | 0 |
| 0.9215277777777778 | 0 |
| 0.9222222222222222 | 0 |
| 0.9229166666666666 | 0 |
| 0.9236111111111112 | 0 |
| 0.9243055555555556 | 0 |
| 0.9249999999999999 | 0 |
| 0.9256944444444444 | 0 |
| 0.9263888888888889 | 0 |
| 0.9270833333333334 | 0 |
| 0.9277777777777777 | 0 |
| 0.9284722222222223 | 0 |
| 0.9291666666666667 | 0 |
| 0.9298611111111111 | 0 |
| 0.9305555555555555 | 0 |
| 0.93125 | 0 |
| 0.9319444444444445 | 0 |
| 0.9326388888888889 | 0 |
| 0.9333333333333332 | 0 |
| 0.9340277777777778 | 0 |
| 0.9347222222222222 | 0 |
| 0.9354166666666667 | 0 |
| 0.936111111111111 | 0 |
| 0.9368055555555556 | 0 |
| 0.9375 | 0 |
| 0.9381944444444444 | 0 |
| 0.938888888888889 | 0 |
| 0.9395833333333333 | 0 |
| 0.9402777777777778 | 0 |
| 0.9409722222222222 | 0 |
| 0.9416666666666668 | 0 |
| 0.9423611111111111 | 0 |
| 0.9430555555555555 | 0 |
| 0.94375 | 0 |
| 0.9444444444444445 | 0 |
| 0.9451388888888889 | 0 |
| 0.9458333333333333 | 0 |
| 0.9465277777777777 | 0 |
| 0.9472222222222223 | 0 |
| 0.9479166666666666 | 0 |
| 0.9486111111111111 | 0 |
| 0.9493055555555556 | 0 |
| 0.9500000000000001 | 0 |
| 0.9506944444444444 | 0 |
| 0.9513888888888888 | 0 |
| 0.9520833333333334 | 0 |
| 0.9527777777777778 | 0 |
| 0.9534722222222222 | 0 |
| 0.9541666666666666 | 0 |
| 0.9548611111111112 | 0 |
| 0.9555555555555556 | 0 |
| 0.9562499999999999 | 0 |
| 0.9569444444444444 | 0 |
| 0.9576388888888889 | 0 |
| 0.9583333333333334 | 0 |
| 0.9590277777777777 | 0 |
| 0.9597222222222223 | 0 |
| 0.9604166666666667 | 0 |
| 0.9611111111111111 | 0 |
| 0.9618055555555555 | 0 |
| 0.9625 | 0 |
| 0.9631944444444445 | 0 |
| 0.9638888888888889 | 0 |
| 0.9645833333333332 | 0 |
| 0.9652777777777778 | 0 |
| 0.9659722222222222 | 0 |
| 0.9666666666666667 | 0 |
| 0.967361111111111 | 0 |
| 0.9680555555555556 | 0 |
| 0.96875 | 0 |
| 0.9694444444444444 | 0 |
| 0.970138888888889 | 0 |
| 0.9708333333333333 | 0 |
| 0.9715277777777778 | 0 |
| 0.9722222222222222 | 0 |
| 0.9729166666666668 | 0 |
| 0.9736111111111111 | 0 |
| 0.9743055555555555 | 0 |
| 0.975 | 0 |
| 0.9756944444444445 | 0 |
| 0.9763888888888889 | 0 |
| 0.9770833333333333 | 0 |
| 0.9777777777777777 | 0 |
| 0.9784722222222223 | 0 |
| 0.9791666666666666 | 0 |
| 0.9798611111111111 | 0 |
| 0.9805555555555556 | 0 |
| 0.9812500000000001 | 0 |
| 0.9819444444444444 | 0 |
| 0.9826388888888888 | 0 |
| 0.9833333333333334 | 0 |
| 0.9840277777777778 | 0 |
| 0.9847222222222222 | 0 |
| 0.9854166666666666 | 0 |
| 0.9861111111111112 | 0 |
| 0.9868055555555556 | 0 |
| 0.9874999999999999 | 0 |
| 0.9881944444444444 | 0 |
| 0.9888888888888889 | 0 |
| 0.9895833333333334 | 0 |
| 0.9902777777777777 | 0 |
| 0.9909722222222223 | 0 |
| 0.9916666666666667 | 0 |
| 0.9923611111111111 | 0 |
| 0.9930555555555555 | 0 |
| 0.99375 | 0 |
| 0.9944444444444445 | 0 |
| 0.9951388888888889 | 0 |
| 0.9958333333333332 | 0 |
| 0.9965277777777778 | 0 |
| 0.9972222222222222 | 0 |
| 0.9979166666666667 | 0 |
| 0.998611111111111 | 0 |
| 0.9993055555555556 | 0 |